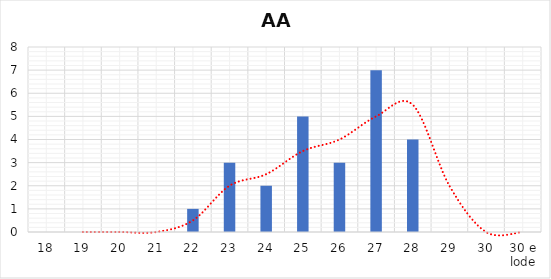
| Category | Series 0 |
|---|---|
| 18 | 0 |
| 19 | 0 |
| 20 | 0 |
| 21 | 0 |
| 22 | 1 |
| 23 | 3 |
| 24 | 2 |
| 25 | 5 |
| 26 | 3 |
| 27 | 7 |
| 28 | 4 |
| 29 | 0 |
| 30 | 0 |
| 30 e lode | 0 |